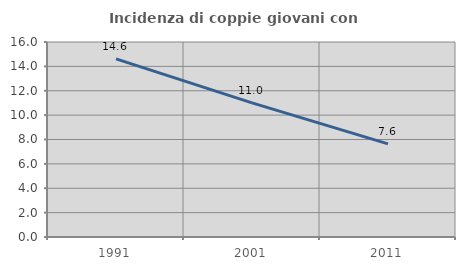
| Category | Incidenza di coppie giovani con figli |
|---|---|
| 1991.0 | 14.62 |
| 2001.0 | 11.003 |
| 2011.0 | 7.645 |